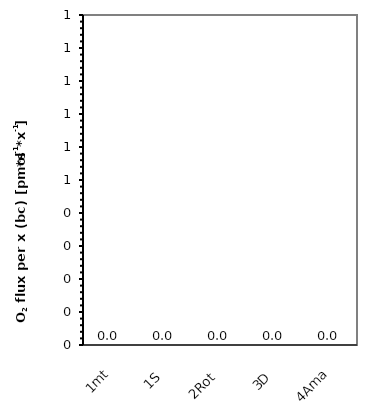
| Category | O2 flux per x (bc) |
|---|---|
| 1mt | 0 |
| 1S | 0 |
| 2Rot | 0 |
| 3D | 0 |
| 4Ama | 0 |